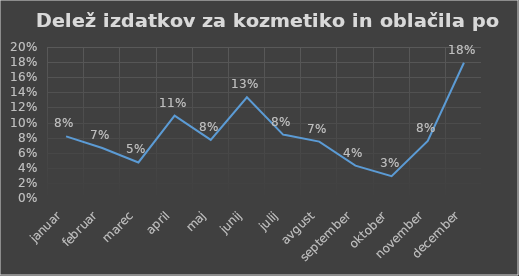
| Category | Series 0 |
|---|---|
| januar | 0.082 |
| februar | 0.066 |
| marec | 0.047 |
| april | 0.109 |
| maj | 0.077 |
| junij | 0.133 |
| julij | 0.084 |
| avgust | 0.075 |
| september | 0.043 |
| oktober | 0.029 |
| november | 0.076 |
| december | 0.179 |